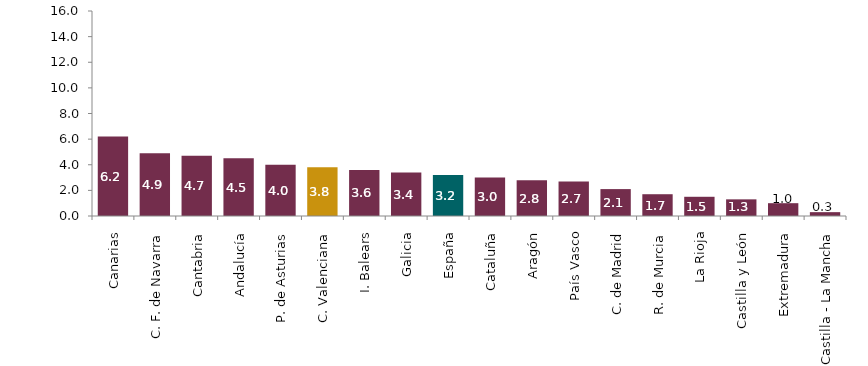
| Category | Vivienda de segunda mano |
|---|---|
| Canarias | 6.2 |
| C. F. de Navarra | 4.9 |
| Cantabria | 4.7 |
| Andalucía | 4.5 |
| P. de Asturias | 4 |
| C. Valenciana | 3.8 |
| I. Balears | 3.6 |
| Galicia | 3.4 |
| España | 3.2 |
| Cataluña | 3 |
| Aragón | 2.8 |
| País Vasco | 2.7 |
| C. de Madrid | 2.1 |
| R. de Murcia | 1.7 |
| La Rioja | 1.5 |
| Castilla y León | 1.3 |
| Extremadura | 1 |
| Castilla - La Mancha | 0.3 |